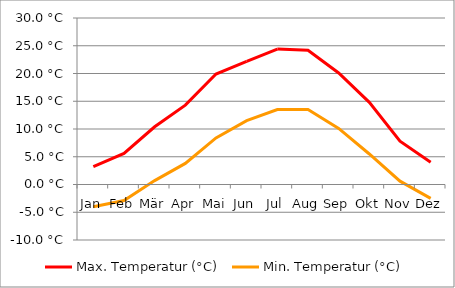
| Category | Max. Temperatur (°C) | Min. Temperatur (°C) |
|---|---|---|
| Jan | 3.2 | -4 |
| Feb | 5.6 | -2.9 |
| Mär | 10.4 | 0.7 |
| Apr | 14.3 | 3.8 |
| Mai | 19.9 | 8.4 |
| Jun | 22.2 | 11.5 |
| Jul | 24.4 | 13.5 |
| Aug | 24.2 | 13.5 |
| Sep | 20.1 | 10.1 |
| Okt | 14.8 | 5.5 |
| Nov | 7.8 | 0.6 |
| Dez | 4 | -2.5 |